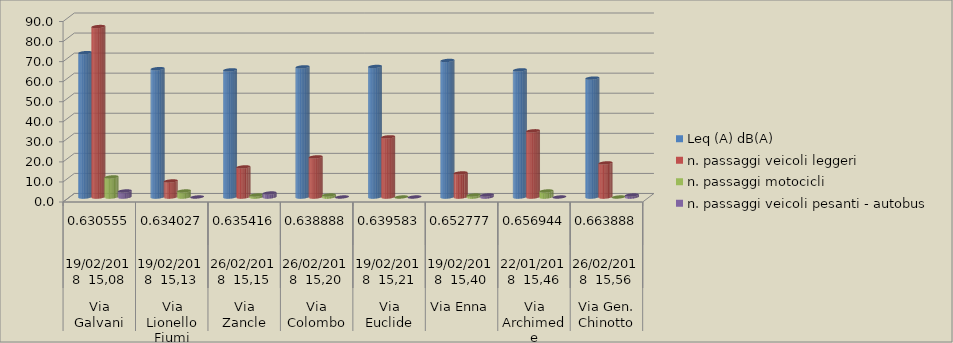
| Category | Leq (A) dB(A) | n. passaggi veicoli leggeri  | n. passaggi motocicli | n. passaggi veicoli pesanti - autobus  |
|---|---|---|---|---|
| 0 | 72 | 85 | 10 | 3 |
| 1 | 64 | 8 | 3 | 0 |
| 2 | 63.4 | 15 | 1 | 2 |
| 3 | 64.9 | 20 | 1 | 0 |
| 4 | 65.1 | 30 | 0 | 0 |
| 5 | 68.1 | 12 | 1 | 1 |
| 6 | 63.4 | 33 | 3 | 0 |
| 7 | 59.3 | 17 | 0 | 1 |